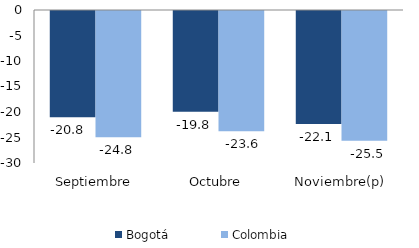
| Category | Bogotá | Colombia |
|---|---|---|
| Septiembre | -20.831 | -24.757 |
| Octubre | -19.772 | -23.556 |
| Noviembre(p) | -22.149 | -25.457 |